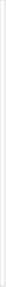
| Category | Parque Automotor (taxis) |
|---|---|
| 2017.0 | 12101 |
| 2018.0 | 12227 |
| 2019.0 | 12354 |
| 2020.0 | 12482 |
| 2021.0 | 12611 |
| 2022.0 | 12739 |
| 2023.0 | 12869 |
| 2024.0 | 12999 |
| 2025.0 | 13129 |
| 2026.0 | 13247 |
| 2027.0 | 0 |
| 2028.0 | 0 |